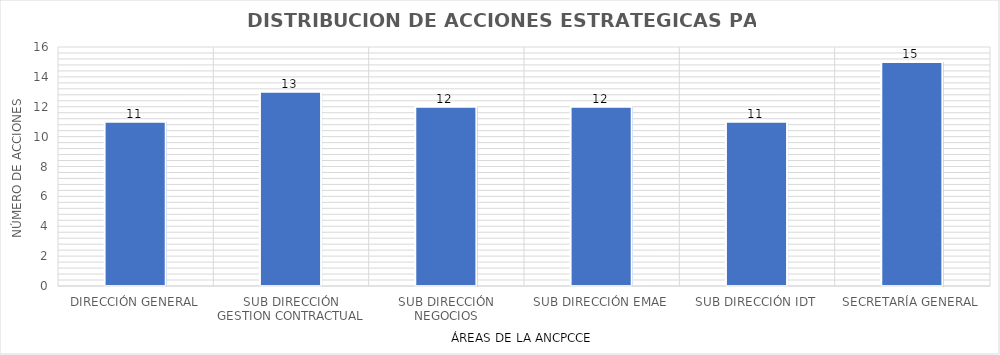
| Category | Series 0 |
|---|---|
| DIRECCIÓN GENERAL | 11 |
| SUB DIRECCIÓN GESTION CONTRACTUAL | 13 |
| SUB DIRECCIÓN NEGOCIOS | 12 |
| SUB DIRECCIÓN EMAE | 12 |
| SUB DIRECCIÓN IDT | 11 |
| SECRETARÍA GENERAL | 15 |